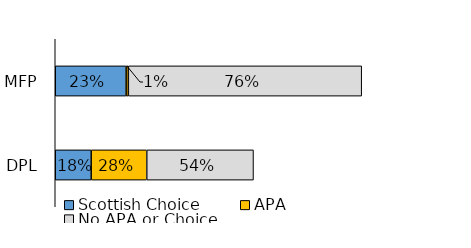
| Category | Scottish Choice | APA | No APA or Choice |
|---|---|---|---|
| 0 | 38947 | 1209 | 128217 |
| 1 | 19750 | 30518 | 58657 |